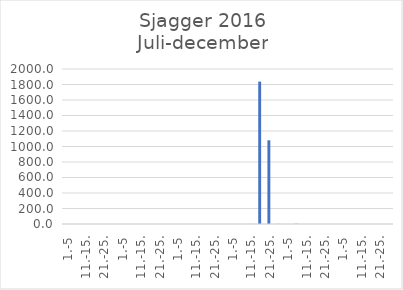
| Category | Series 0 |
|---|---|
| 1.-5 | 0 |
| 6.-10. | 0 |
| 11.-15. | 0 |
| 16.-20. | 0 |
| 21.-25. | 0 |
| 26.-31. | 0 |
| 1.-5 | 0 |
| 6.-10. | 0 |
| 11.-15. | 0 |
| 16.-20. | 0 |
| 21.-25. | 0 |
| 26.-31. | 0 |
| 1.-5 | 0 |
| 6.-10. | 0 |
| 11.-15. | 0 |
| 16.-20. | 0 |
| 21.-25. | 0 |
| 26.-30. | 0 |
| 1.-5 | 0 |
| 6.-10. | 0 |
| 11.-15. | 1.059 |
| 16.-20. | 1837.462 |
| 21.-25. | 1079.739 |
| 26.-31. | 1.619 |
| 1.-5 | 0 |
| 6.-10. | 3.158 |
| 11.-15. | 0 |
| 16.-20. | 0 |
| 21.-25. | 0 |
| 26.-30. | 0 |
| 1.-5 | 0 |
| 6.-10. | 0 |
| 11.-15. | 0 |
| 16.-20. | 0 |
| 21.-25. | 0 |
| 26.-31. | 0 |